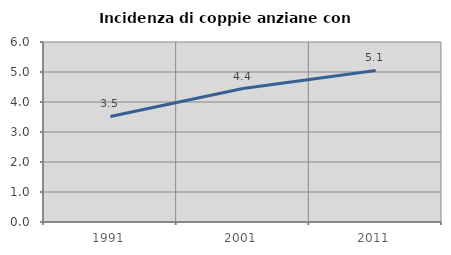
| Category | Incidenza di coppie anziane con figli |
|---|---|
| 1991.0 | 3.519 |
| 2001.0 | 4.448 |
| 2011.0 | 5.051 |